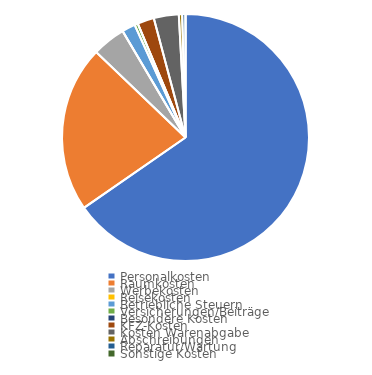
| Category | Series 0 |
|---|---|
| Personalkosten | 0.654 |
| Raumkosten | 0.218 |
| Werbekosten | 0.044 |
| Reisekosten | 0 |
| Betriebliche Steuern | 0.017 |
| Versicherungen/Beiträge | 0.004 |
| Besondere Kosten | 0 |
| KFZ-Kosten | 0.022 |
| Kosten Warenabgabe | 0.033 |
| Abschreibungen | 0.004 |
| Reparatur/Wartung | 0.004 |
| Sonstige Kosten | 0 |